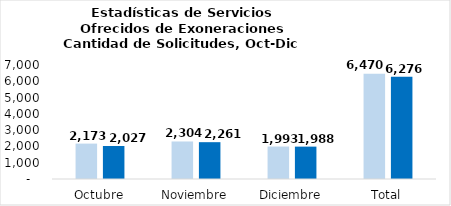
| Category | Tramitadas |
|---|---|
| Octubre | 2027 |
| Noviembre | 2261 |
| Diciembre | 1988 |
| Total | 6276 |